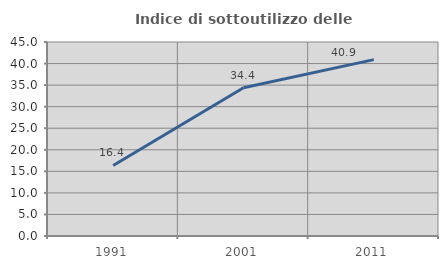
| Category | Indice di sottoutilizzo delle abitazioni  |
|---|---|
| 1991.0 | 16.354 |
| 2001.0 | 34.375 |
| 2011.0 | 40.919 |